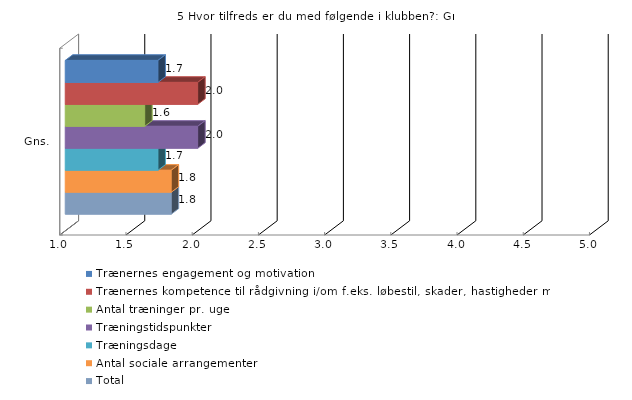
| Category | Trænernes engagement og motivation | Trænernes kompetence til rådgivning i/om f.eks. løbestil, skader, hastigheder mm.  | Antal træninger pr. uge | Træningstidspunkter | Træningsdage | Antal sociale arrangementer | Total |
|---|---|---|---|---|---|---|---|
| Gns. | 1.7 | 2 | 1.6 | 2 | 1.7 | 1.8 | 1.8 |